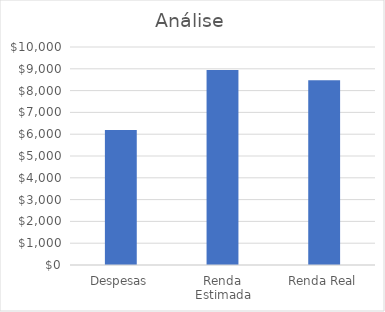
| Category | Series 0 |
|---|---|
| Despesas | 6190 |
| Renda Estimada | 8944 |
| Renda Real | 8476 |